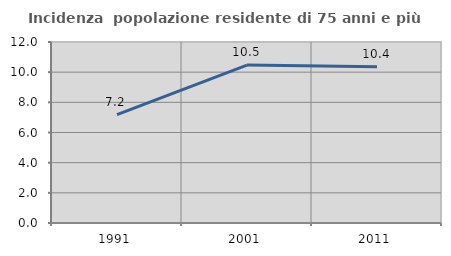
| Category | Incidenza  popolazione residente di 75 anni e più |
|---|---|
| 1991.0 | 7.187 |
| 2001.0 | 10.467 |
| 2011.0 | 10.357 |